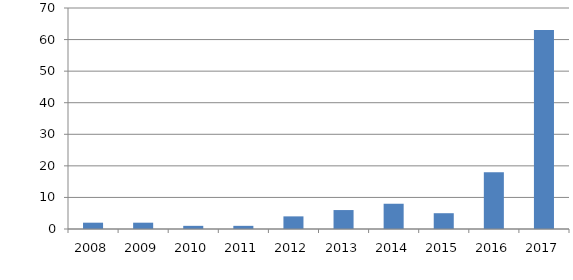
| Category | Series 0 |
|---|---|
| 2008.0 | 2 |
| 2009.0 | 2 |
| 2010.0 | 1 |
| 2011.0 | 1 |
| 2012.0 | 4 |
| 2013.0 | 6 |
| 2014.0 | 8 |
| 2015.0 | 5 |
| 2016.0 | 18 |
| 2017.0 | 63 |